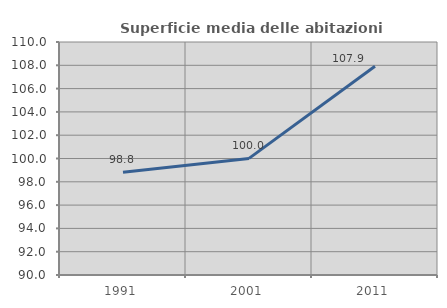
| Category | Superficie media delle abitazioni occupate |
|---|---|
| 1991.0 | 98.814 |
| 2001.0 | 100.009 |
| 2011.0 | 107.914 |